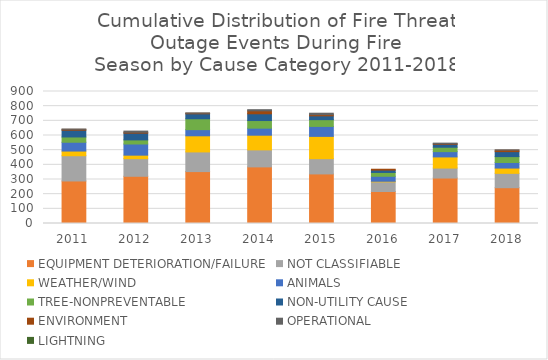
| Category | EQUIPMENT DETERIORATION/FAILURE | NOT CLASSIFIABLE | WEATHER/WIND | ANIMALS | TREE-NONPREVENTABLE | NON-UTILITY CAUSE | ENVIRONMENT | OPERATIONAL | LIGHTNING |
|---|---|---|---|---|---|---|---|---|---|
| 2011.0 | 290 | 172 | 32 | 60 | 36 | 46 | 6 | 2 | 0 |
| 2012.0 | 322 | 120 | 24 | 76 | 28 | 46 | 6 | 8 | 0 |
| 2013.0 | 354 | 134 | 110 | 42 | 74 | 34 | 4 | 2 | 0 |
| 2014.0 | 386 | 116 | 100 | 48 | 52 | 46 | 20 | 8 | 0 |
| 2015.0 | 338 | 104 | 152 | 68 | 46 | 26 | 8 | 10 | 0 |
| 2016.0 | 218 | 66 | 4 | 34 | 26 | 16 | 6 | 0 | 0 |
| 2017.0 | 310 | 68 | 76 | 36 | 30 | 20 | 4 | 4 | 0 |
| 2018.0 | 244 | 98 | 36 | 38 | 40 | 34 | 10 | 2 | 0 |